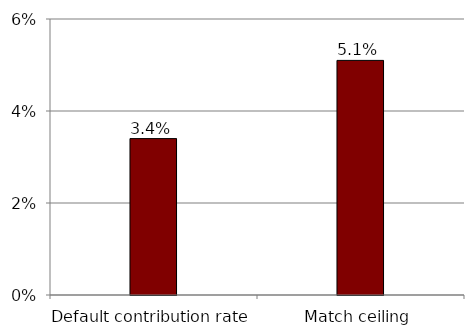
| Category | Series 0 |
|---|---|
| Default contribution rate | 0.034 |
| Match ceiling | 0.051 |